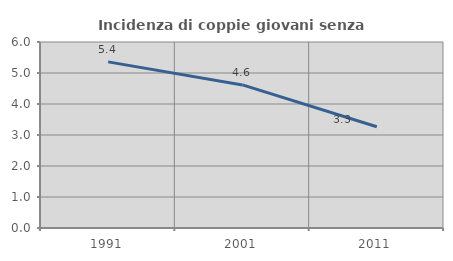
| Category | Incidenza di coppie giovani senza figli |
|---|---|
| 1991.0 | 5.359 |
| 2001.0 | 4.616 |
| 2011.0 | 3.266 |